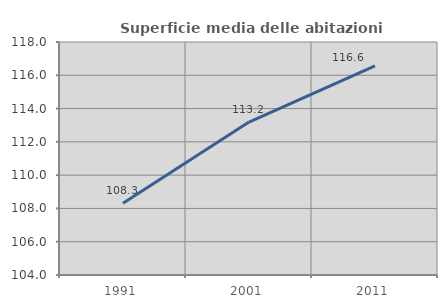
| Category | Superficie media delle abitazioni occupate |
|---|---|
| 1991.0 | 108.312 |
| 2001.0 | 113.191 |
| 2011.0 | 116.565 |